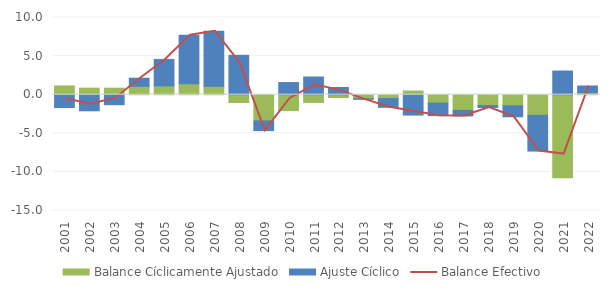
| Category | Balance Cíclicamente Ajustado | Ajuste Cíclico |
|---|---|---|
| 2001.0 | 1.136 | -1.669 |
| 2002.0 | 0.847 | -2.084 |
| 2003.0 | 0.844 | -1.295 |
| 2004.0 | 1.086 | 1.049 |
| 2005.0 | 1.138 | 3.427 |
| 2006.0 | 1.414 | 6.293 |
| 2007.0 | 1.084 | 7.129 |
| 2008.0 | -1.012 | 5.1 |
| 2009.0 | -3.393 | -1.259 |
| 2010.0 | -2.056 | 1.571 |
| 2011.0 | -1.004 | 2.289 |
| 2012.0 | -0.371 | 0.935 |
| 2013.0 | -0.518 | -0.082 |
| 2014.0 | -0.503 | -1.131 |
| 2015.0 | 0.475 | -2.64 |
| 2016.0 | -1.083 | -1.628 |
| 2017.0 | -2.032 | -0.72 |
| 2018.0 | -1.404 | -0.249 |
| 2019.0 | -1.444 | -1.419 |
| 2020.0 | -2.666 | -4.637 |
| 2021.0 | -10.761 | 3.065 |
| 2022.0 | 0.246 | 0.881 |